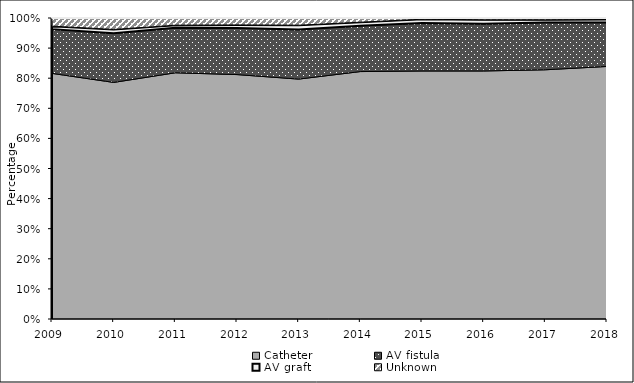
| Category | Catheter | AV fistula | AV graft | Unknown |
|---|---|---|---|---|
| 2009.0 | 81.6 | 14.7 | 1 | 2.7 |
| 2010.0 | 78.6 | 16.3 | 1.3 | 3.9 |
| 2011.0 | 81.8 | 15 | 0.8 | 2.3 |
| 2012.0 | 81.2 | 15.5 | 1 | 2.3 |
| 2013.0 | 79.7 | 16.5 | 1.4 | 2.4 |
| 2014.0 | 82.2 | 15.2 | 1.2 | 1.4 |
| 2015.0 | 82.4 | 15.9 | 1.3 | 0.4 |
| 2016.0 | 82.4 | 15.7 | 1.3 | 0.6 |
| 2017.0 | 82.8 | 15.7 | 0.9 | 0.5 |
| 2018.0 | 83.9 | 14.6 | 1 | 0.4 |